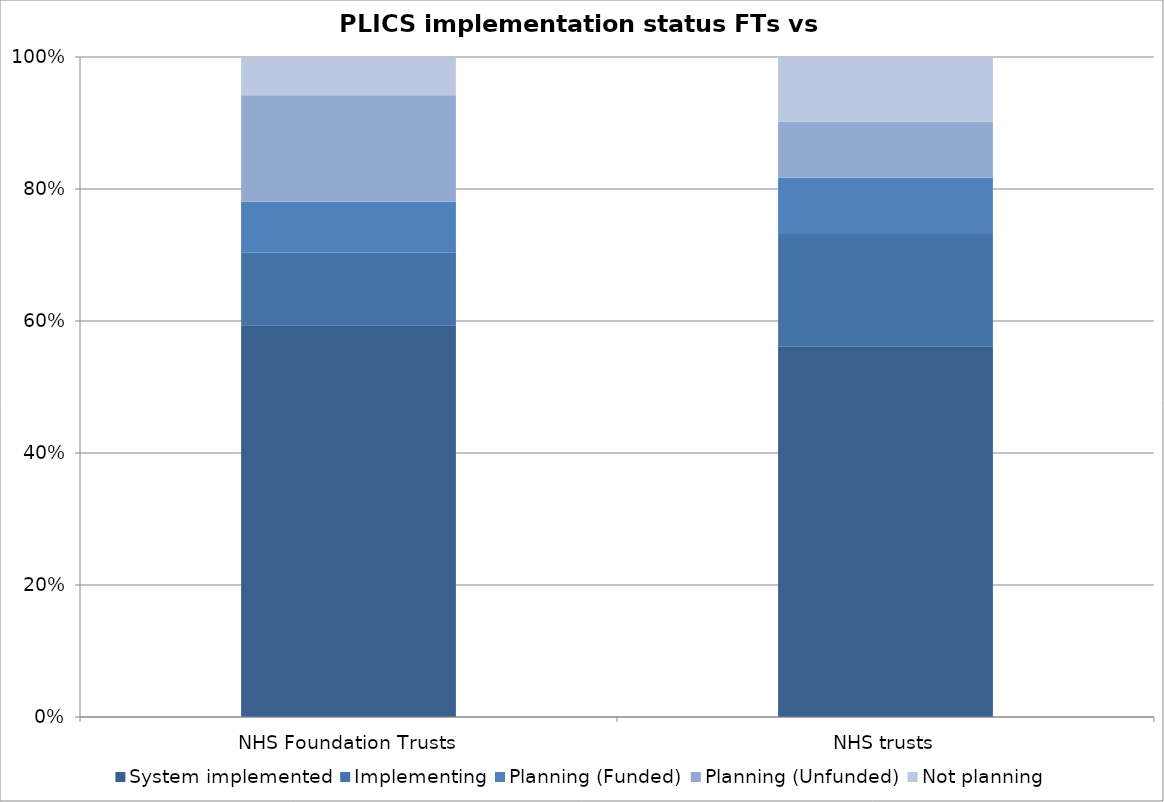
| Category | System implemented | Implementing | Planning (Funded) | Planning (Unfunded) | Not planning |
|---|---|---|---|---|---|
| NHS Foundation Trusts | 92 | 17 | 12 | 25 | 9 |
| NHS trusts | 46 | 14 | 7 | 7 | 8 |